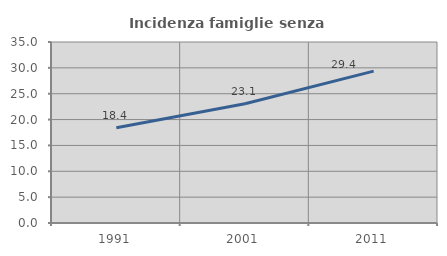
| Category | Incidenza famiglie senza nuclei |
|---|---|
| 1991.0 | 18.425 |
| 2001.0 | 23.055 |
| 2011.0 | 29.372 |